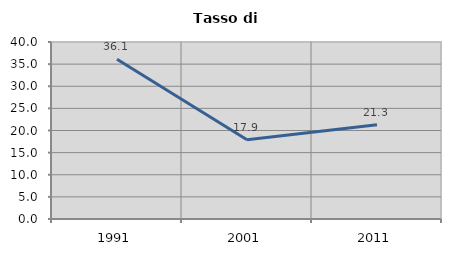
| Category | Tasso di disoccupazione   |
|---|---|
| 1991.0 | 36.12 |
| 2001.0 | 17.918 |
| 2011.0 | 21.282 |